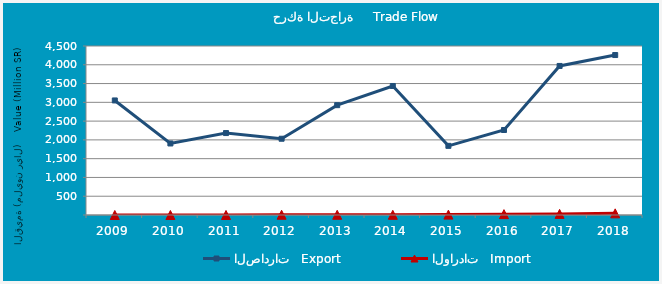
| Category | الصادرات   Export | الواردات   Import |
|---|---|---|
| 2009.0 | 3050355852 | 14076 |
| 2010.0 | 1904602172 | 422353 |
| 2011.0 | 2181873037 | 906222 |
| 2012.0 | 2030709528 | 6759759 |
| 2013.0 | 2924638234 | 5864447 |
| 2014.0 | 3435334407 | 5038115 |
| 2015.0 | 1841122331 | 10072781 |
| 2016.0 | 2263575725 | 23298061 |
| 2017.0 | 3968878892 | 29802073 |
| 2018.0 | 4259177834 | 44418902 |